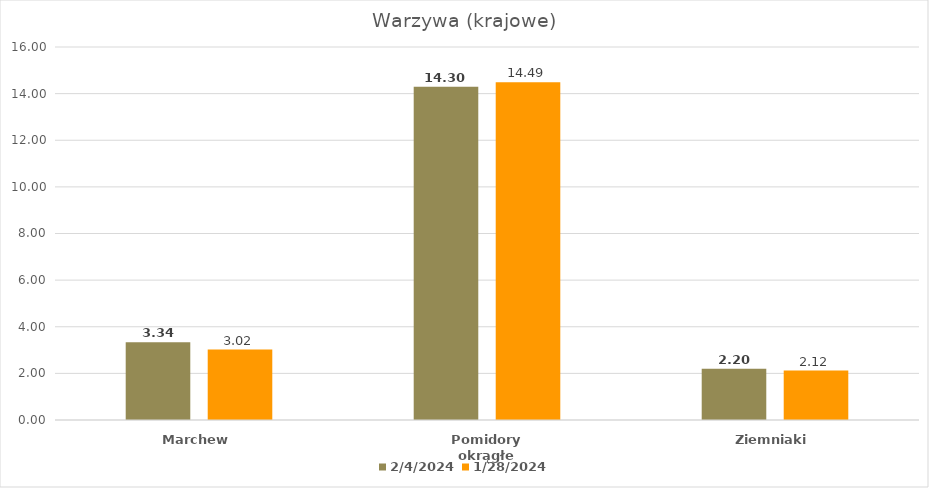
| Category | 04.02.2024 | 28.01.2024 |
|---|---|---|
| Marchew | 3.34 | 3.02 |
| Pomidory okrągłe | 14.3 | 14.49 |
| Ziemniaki | 2.2 | 2.12 |